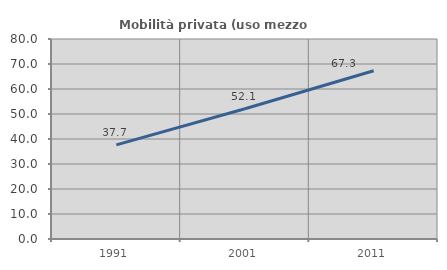
| Category | Mobilità privata (uso mezzo privato) |
|---|---|
| 1991.0 | 37.662 |
| 2001.0 | 52.116 |
| 2011.0 | 67.316 |